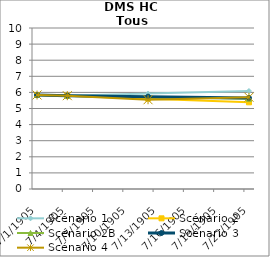
| Category | Scénario 1 | Scénario 2 | Scénario 2B | Scénario 3 | Scénario 4 |
|---|---|---|---|---|---|
| 2009.0 | 5.839 | 5.839 | 5.839 | 5.839 | 5.839 |
| 2012.0 | 5.796 | 5.796 | 5.796 | 5.796 | 5.796 |
| 2020.0 | 5.925 | 5.613 | 5.71 | 5.735 | 5.544 |
| 2030.0 | 6.085 | 5.383 | 5.601 | 5.658 | 5.701 |